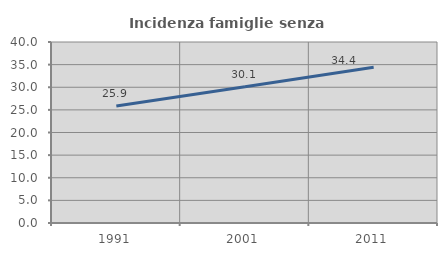
| Category | Incidenza famiglie senza nuclei |
|---|---|
| 1991.0 | 25.875 |
| 2001.0 | 30.096 |
| 2011.0 | 34.398 |